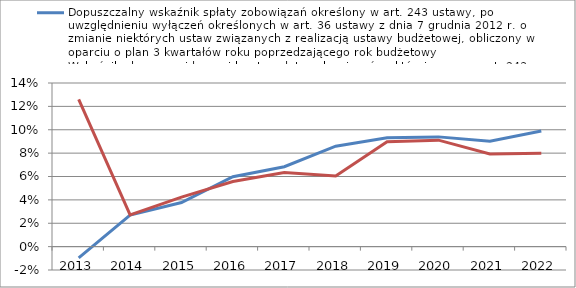
| Category | Dopuszczalny wskaźnik spłaty zobowiązań określony w art. 243 ustawy, po uwzględnieniu wyłączeń określonych w art. 36 ustawy z dnia 7 grudnia 2012 r. o zmianie niektórych ustaw związanych z realizacją ustawy budżetowej, obliczony w oparciu o plan 3 kwartał | Wskaźnik planowanej łącznej kwoty spłaty zobowiązań, o której mowa w art. 243 ust. 1 ustawy do dochodów ogółem, po uwzględnieniu zobowiązań związku współtworzonego przez jednostkę samorządu terytorialnego oraz po uwzględnieniu wyłączeń przypadających na d |
|---|---|---|
| 2013.0 | -0.01 | 0.126 |
| 2014.0 | 0.027 | 0.027 |
| 2015.0 | 0.038 | 0.042 |
| 2016.0 | 0.06 | 0.056 |
| 2017.0 | 0.068 | 0.063 |
| 2018.0 | 0.086 | 0.06 |
| 2019.0 | 0.093 | 0.09 |
| 2020.0 | 0.094 | 0.091 |
| 2021.0 | 0.09 | 0.079 |
| 2022.0 | 0.099 | 0.08 |